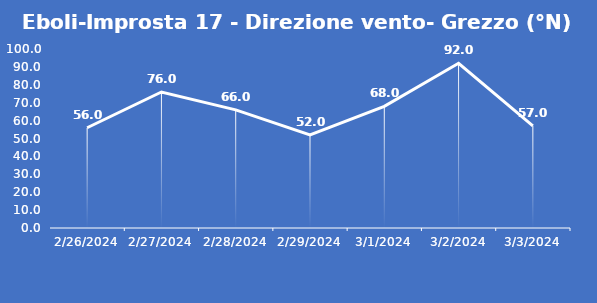
| Category | Eboli-Improsta 17 - Direzione vento- Grezzo (°N) |
|---|---|
| 2/26/24 | 56 |
| 2/27/24 | 76 |
| 2/28/24 | 66 |
| 2/29/24 | 52 |
| 3/1/24 | 68 |
| 3/2/24 | 92 |
| 3/3/24 | 57 |